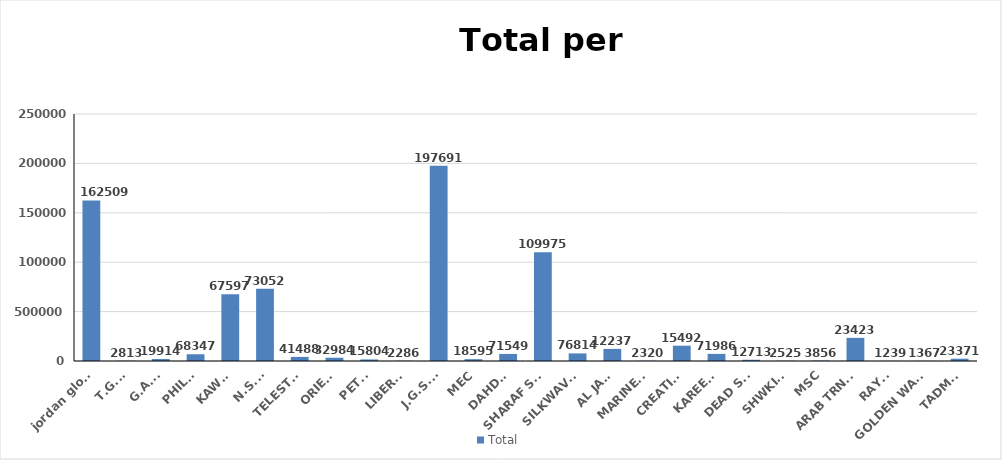
| Category | Total |
|---|---|
| jordan global | 1625097 |
| T.G.F. | 2813 |
| G.A.C. | 19914 |
| PHILCO | 68347 |
| KAWAR | 675978 |
| N.S.S. | 730523 |
| TELESTAR | 41488 |
| ORIENT | 32984 |
| PETRA | 15804 |
| LIBERTY | 2286 |
| J.G.S.A. | 1976910 |
| MEC | 18595 |
| DAHDAL | 71549 |
| SHARAF SHG. | 1099757 |
| SILKWAVES | 76814 |
| AL JAZI | 122378 |
| MARINERS | 2320 |
| CREATIVE | 154923 |
| KAREEM | 71986 |
| DEAD SEA | 12713 |
| SHWKINI | 2525 |
| MSC | 3856 |
| ARAB TRNSIT | 234233 |
| RAYAN | 1239 |
| GOLDEN WAYS | 1367 |
| TADMOR | 23371 |